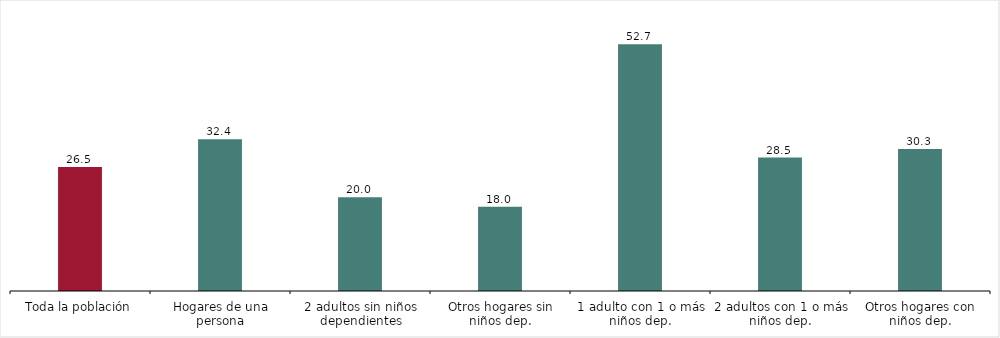
| Category | Tipo de hogar |
|---|---|
| Toda la población | 26.5 |
| Hogares de una persona | 32.4 |
| 2 adultos sin niños dependientes | 20 |
| Otros hogares sin niños dep. | 18 |
| 1 adulto con 1 o más niños dep. | 52.7 |
| 2 adultos con 1 o más niños dep. | 28.5 |
| Otros hogares con niños dep. | 30.3 |